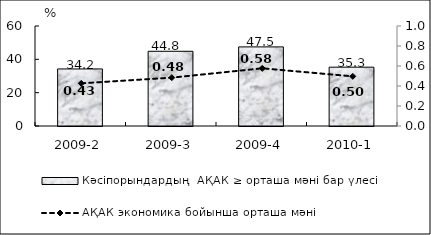
| Category | Кәсіпорындардың  АҚАК ≥ орташа мәні бар үлесі  |
|---|---|
| 2009-2 | 34.23 |
| 2009-3 | 44.83 |
| 2009-4 | 47.46 |
| 2010-1 | 35.29 |